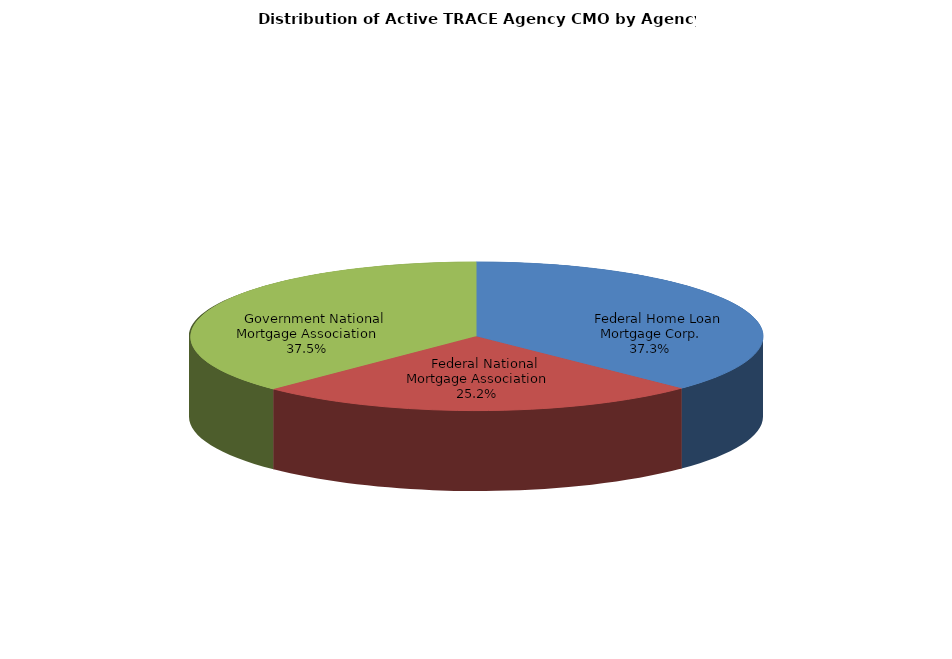
| Category | Series 0 |
|---|---|
|     Federal Home Loan Mortgage Corp. | 100573 |
|     Federal National Mortgage Association | 67844 |
|     Government National Mortgage Association | 101213 |